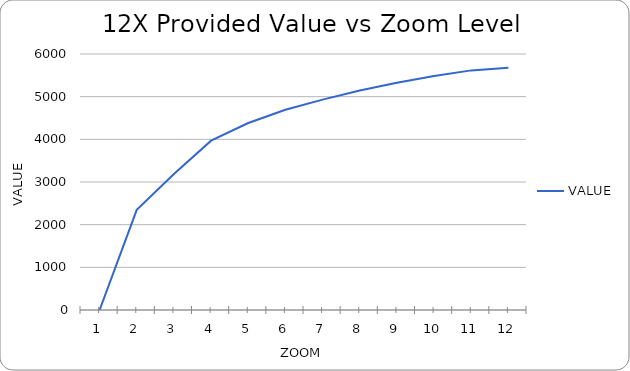
| Category | VALUE |
|---|---|
| 1.0 | 0 |
| 2.0 | 2348 |
| 3.0 | 3185 |
| 4.0 | 3968 |
| 5.0 | 4382 |
| 6.0 | 4692 |
| 7.0 | 4930 |
| 8.0 | 5146 |
| 9.0 | 5324 |
| 10.0 | 5482 |
| 11.0 | 5616 |
| 12.0 | 5680 |